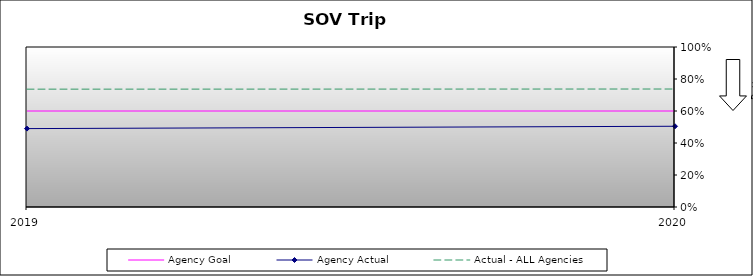
| Category | Agency Goal | Agency Actual | Actual - ALL Agencies |
|---|---|---|---|
| 2019.0 | 0.6 | 0.49 | 0.736 |
| 2020.0 | 0.6 | 0.505 | 0.737 |